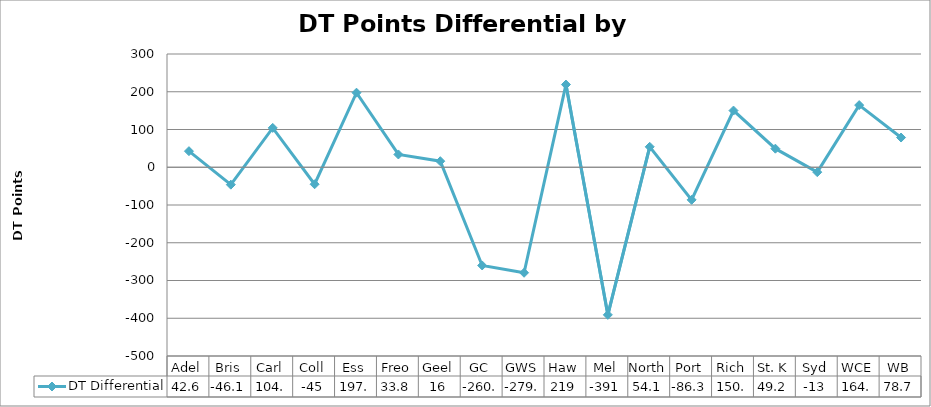
| Category | DT Differential |
|---|---|
| Adel | 42.625 |
| Bris | -46.125 |
| Carl | 104.25 |
| Coll | -45 |
| Ess | 197.5 |
| Freo | 33.875 |
| Geel | 16 |
| GC | -260.125 |
| GWS | -279.5 |
| Haw | 219 |
| Mel | -391 |
| North | 54.125 |
| Port | -86.375 |
| Rich | 150.125 |
| St. K | 49.25 |
| Syd | -13 |
| WCE | 164.625 |
| WB | 78.75 |